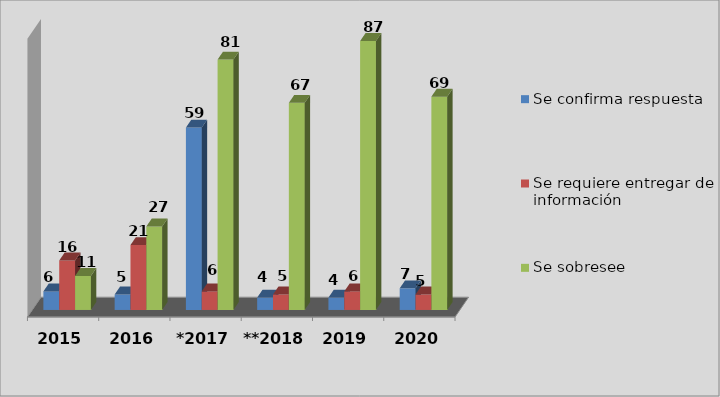
| Category | Se confirma respuesta | Se requiere entregar de información  | Se sobresee  |
|---|---|---|---|
| 2015 | 6 | 16 | 11 |
| 2016 | 5 | 21 | 27 |
| *2017 | 59 | 6 | 81 |
| **2018 | 4 | 5 | 67 |
| 2019 | 4 | 6 | 87 |
| 2020 | 7 | 5 | 69 |